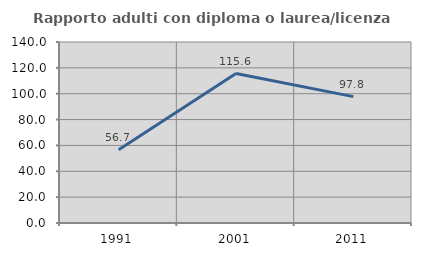
| Category | Rapporto adulti con diploma o laurea/licenza media  |
|---|---|
| 1991.0 | 56.731 |
| 2001.0 | 115.596 |
| 2011.0 | 97.761 |